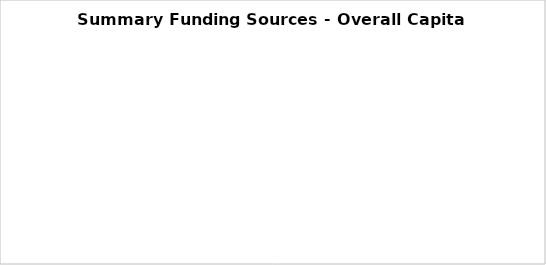
| Category | Series 0 |
|---|---|
| Discretionary - LOI Request | 0 |
| Other AIP funds | 0 |
| Other Federal funding | 0 |
| State grants | 0 |
| PFCs | 0 |
| Bonds | 0 |
| Other | 0 |